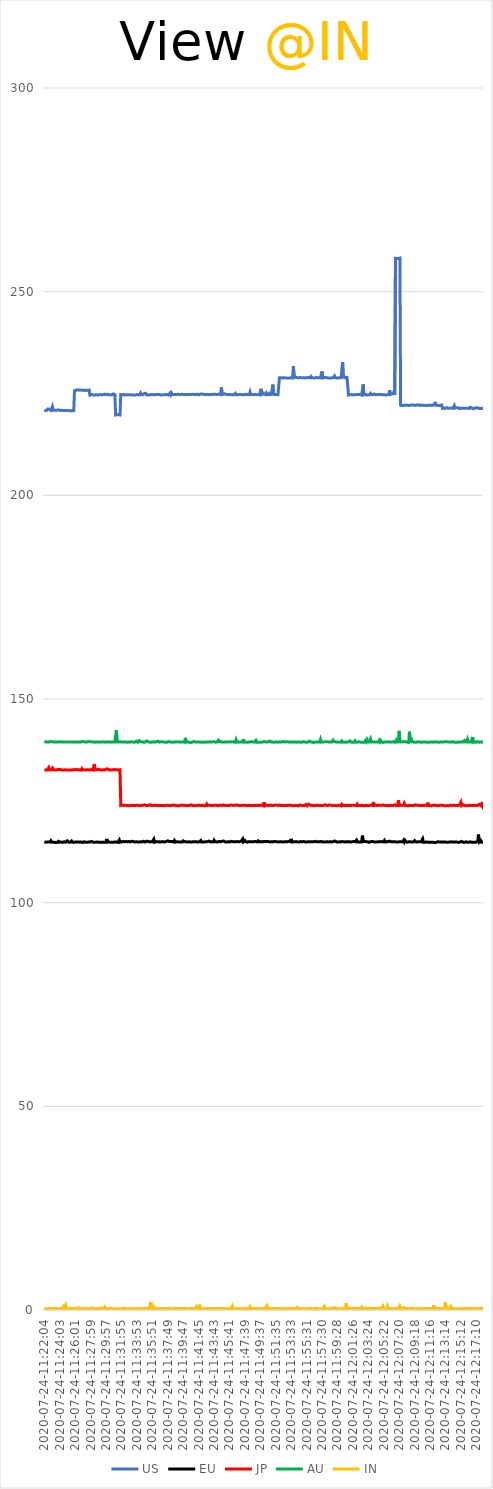
| Category | US | EU | JP | AU | IN |
|---|---|---|---|---|---|
| 2020-07-24-11:22:04 | 220.913 | 114.952 | 132.64 | 139.6 | 0.329 |
| 2020-07-24-11:22:10 | 220.919 | 114.899 | 132.591 | 139.414 | 0.342 |
| 2020-07-24-11:22:16 | 220.847 | 114.837 | 132.584 | 139.466 | 0.325 |
| 2020-07-24-11:22:21 | 220.944 | 114.942 | 132.607 | 139.45 | 0.523 |
| 2020-07-24-11:22:27 | 220.908 | 114.886 | 132.564 | 139.441 | 0.292 |
| 2020-07-24-11:22:33 | 221.206 | 114.859 | 132.6 | 139.367 | 0.326 |
| 2020-07-24-11:22:38 | 220.961 | 114.927 | 133.172 | 139.446 | 0.33 |
| 2020-07-24-11:22:44 | 221.133 | 114.834 | 132.637 | 139.387 | 0.287 |
| 2020-07-24-11:22:49 | 220.93 | 114.868 | 132.773 | 139.54 | 0.345 |
| 2020-07-24-11:22:55 | 220.862 | 115.185 | 132.602 | 139.453 | 0.311 |
| 2020-07-24-11:23:01 | 220.93 | 114.876 | 132.797 | 139.487 | 0.38 |
| 2020-07-24-11:23:06 | 221.796 | 114.824 | 133.045 | 139.453 | 0.331 |
| 2020-07-24-11:23:12 | 220.883 | 114.853 | 132.603 | 139.48 | 0.315 |
| 2020-07-24-11:23:18 | 220.871 | 114.893 | 132.631 | 139.474 | 0.377 |
| 2020-07-24-11:23:23 | 220.881 | 114.811 | 132.611 | 139.424 | 0.389 |
| 2020-07-24-11:23:29 | 221.017 | 114.871 | 132.724 | 139.424 | 0.344 |
| 2020-07-24-11:23:34 | 220.877 | 114.777 | 132.584 | 139.423 | 0.374 |
| 2020-07-24-11:23:40 | 220.997 | 114.881 | 132.594 | 139.419 | 0.363 |
| 2020-07-24-11:23:46 | 220.937 | 114.775 | 132.672 | 139.416 | 0.311 |
| 2020-07-24-11:23:51 | 220.992 | 115.05 | 132.828 | 139.415 | 0.352 |
| 2020-07-24-11:23:57 | 220.928 | 114.827 | 132.726 | 139.496 | 0.313 |
| 2020-07-24-11:24:03 | 220.964 | 114.862 | 132.709 | 139.441 | 0.369 |
| 2020-07-24-11:24:08 | 220.846 | 114.883 | 132.692 | 139.439 | 0.374 |
| 2020-07-24-11:24:14 | 220.808 | 114.864 | 132.578 | 139.391 | 0.303 |
| 2020-07-24-11:24:19 | 220.884 | 114.902 | 132.576 | 139.497 | 0.371 |
| 2020-07-24-11:24:25 | 220.784 | 114.793 | 132.667 | 139.444 | 0.378 |
| 2020-07-24-11:24:31 | 220.826 | 114.891 | 132.562 | 139.415 | 0.858 |
| 2020-07-24-11:24:36 | 220.825 | 114.946 | 132.67 | 139.405 | 0.327 |
| 2020-07-24-11:24:42 | 220.856 | 114.786 | 132.626 | 139.439 | 0.309 |
| 2020-07-24-11:24:48 | 220.884 | 114.836 | 132.647 | 139.421 | 1.147 |
| 2020-07-24-11:24:53 | 220.838 | 114.972 | 132.569 | 139.477 | 0.34 |
| 2020-07-24-11:24:59 | 220.897 | 115.197 | 132.683 | 139.405 | 0.338 |
| 2020-07-24-11:25:04 | 220.836 | 115.03 | 132.574 | 139.429 | 0.334 |
| 2020-07-24-11:25:10 | 220.759 | 114.869 | 132.608 | 139.405 | 0.35 |
| 2020-07-24-11:25:16 | 220.783 | 114.862 | 132.559 | 139.425 | 0.302 |
| 2020-07-24-11:25:21 | 220.828 | 114.834 | 132.646 | 139.453 | 0.391 |
| 2020-07-24-11:25:27 | 220.764 | 114.864 | 132.569 | 139.421 | 0.377 |
| 2020-07-24-11:25:33 | 220.907 | 115.127 | 132.618 | 139.393 | 0.345 |
| 2020-07-24-11:25:38 | 220.799 | 114.861 | 132.607 | 139.454 | 0.37 |
| 2020-07-24-11:25:44 | 220.865 | 114.877 | 132.711 | 139.405 | 0.299 |
| 2020-07-24-11:25:49 | 220.788 | 114.813 | 132.623 | 139.405 | 0.354 |
| 2020-07-24-11:25:55 | 225.671 | 114.894 | 132.633 | 139.54 | 0.45 |
| 2020-07-24-11:26:01 | 225.749 | 114.908 | 132.691 | 139.481 | 0.353 |
| 2020-07-24-11:26:06 | 225.782 | 114.81 | 132.62 | 139.431 | 0.39 |
| 2020-07-24-11:26:12 | 225.771 | 114.895 | 132.662 | 139.432 | 0.387 |
| 2020-07-24-11:26:18 | 225.927 | 114.866 | 132.561 | 139.45 | 0.318 |
| 2020-07-24-11:26:23 | 225.75 | 114.897 | 132.626 | 139.437 | 0.587 |
| 2020-07-24-11:26:29 | 225.818 | 114.86 | 132.694 | 139.499 | 0.336 |
| 2020-07-24-11:26:34 | 225.848 | 114.854 | 132.655 | 139.437 | 0.376 |
| 2020-07-24-11:26:40 | 225.87 | 114.81 | 132.608 | 139.451 | 0.334 |
| 2020-07-24-11:26:46 | 225.871 | 114.915 | 132.546 | 139.432 | 0.292 |
| 2020-07-24-11:26:51 | 225.768 | 114.857 | 132.871 | 139.506 | 0.315 |
| 2020-07-24-11:26:57 | 225.747 | 114.76 | 132.597 | 139.59 | 0.359 |
| 2020-07-24-11:27:03 | 225.859 | 114.923 | 132.592 | 139.412 | 0.365 |
| 2020-07-24-11:27:08 | 225.81 | 114.938 | 132.611 | 139.473 | 0.42 |
| 2020-07-24-11:27:14 | 225.731 | 114.821 | 132.529 | 139.355 | 0.334 |
| 2020-07-24-11:27:19 | 225.773 | 114.843 | 132.571 | 139.447 | 0.36 |
| 2020-07-24-11:27:25 | 225.793 | 114.825 | 132.609 | 139.401 | 0.326 |
| 2020-07-24-11:27:31 | 225.768 | 114.851 | 132.647 | 139.418 | 0.328 |
| 2020-07-24-11:27:36 | 225.814 | 114.885 | 132.62 | 139.417 | 0.392 |
| 2020-07-24-11:27:42 | 225.779 | 114.875 | 132.608 | 139.557 | 0.343 |
| 2020-07-24-11:27:48 | 225.839 | 114.77 | 132.607 | 139.366 | 0.303 |
| 2020-07-24-11:27:53 | 224.618 | 114.869 | 132.574 | 139.496 | 0.335 |
| 2020-07-24-11:27:59 | 224.615 | 114.792 | 132.6 | 139.434 | 0.346 |
| 2020-07-24-11:28:04 | 224.775 | 115.032 | 132.684 | 139.48 | 0.482 |
| 2020-07-24-11:28:10 | 224.878 | 114.884 | 132.647 | 139.506 | 0.492 |
| 2020-07-24-11:28:16 | 224.658 | 114.861 | 132.589 | 139.45 | 0.362 |
| 2020-07-24-11:28:21 | 224.659 | 114.984 | 132.756 | 139.42 | 0.352 |
| 2020-07-24-11:28:27 | 224.617 | 114.818 | 134.012 | 139.428 | 0.314 |
| 2020-07-24-11:28:33 | 224.836 | 114.852 | 132.603 | 139.427 | 0.323 |
| 2020-07-24-11:28:38 | 224.703 | 114.849 | 132.639 | 139.407 | 0.318 |
| 2020-07-24-11:28:44 | 224.753 | 114.886 | 132.623 | 139.494 | 0.307 |
| 2020-07-24-11:28:50 | 224.658 | 114.893 | 132.642 | 139.455 | 0.382 |
| 2020-07-24-11:28:55 | 224.615 | 114.859 | 132.74 | 139.499 | 0.348 |
| 2020-07-24-11:29:01 | 224.637 | 114.843 | 132.618 | 139.457 | 0.412 |
| 2020-07-24-11:29:06 | 224.672 | 114.89 | 132.645 | 139.482 | 0.406 |
| 2020-07-24-11:29:12 | 224.754 | 114.809 | 132.56 | 139.41 | 0.276 |
| 2020-07-24-11:29:18 | 224.624 | 114.789 | 132.601 | 139.423 | 0.342 |
| 2020-07-24-11:29:23 | 224.695 | 114.804 | 132.651 | 139.45 | 0.326 |
| 2020-07-24-11:29:29 | 224.694 | 114.785 | 132.56 | 139.46 | 0.345 |
| 2020-07-24-11:29:35 | 224.688 | 114.805 | 132.584 | 139.486 | 0.317 |
| 2020-07-24-11:29:40 | 224.681 | 114.858 | 132.658 | 139.489 | 0.325 |
| 2020-07-24-11:29:46 | 224.846 | 114.86 | 132.613 | 139.402 | 0.654 |
| 2020-07-24-11:29:51 | 224.737 | 114.804 | 132.641 | 139.439 | 0.324 |
| 2020-07-24-11:29:57 | 224.701 | 114.839 | 132.604 | 139.467 | 0.355 |
| 2020-07-24-11:30:03 | 224.688 | 115.637 | 132.858 | 139.432 | 0.369 |
| 2020-07-24-11:30:08 | 224.825 | 114.923 | 132.937 | 139.459 | 0.384 |
| 2020-07-24-11:30:14 | 224.661 | 114.839 | 132.744 | 139.434 | 0.404 |
| 2020-07-24-11:30:20 | 224.651 | 114.874 | 132.611 | 139.467 | 0.315 |
| 2020-07-24-11:30:25 | 224.674 | 114.814 | 132.602 | 139.442 | 0.327 |
| 2020-07-24-11:30:31 | 224.692 | 114.825 | 132.605 | 139.446 | 0.317 |
| 2020-07-24-11:30:36 | 224.676 | 114.833 | 132.582 | 139.411 | 0.414 |
| 2020-07-24-11:30:42 | 224.654 | 114.821 | 132.578 | 139.412 | 0.344 |
| 2020-07-24-11:30:48 | 224.701 | 114.872 | 132.602 | 139.379 | 0.315 |
| 2020-07-24-11:30:53 | 224.891 | 114.802 | 132.688 | 139.435 | 0.376 |
| 2020-07-24-11:30:59 | 224.686 | 114.794 | 132.687 | 139.498 | 0.313 |
| 2020-07-24-11:31:05 | 224.715 | 114.909 | 132.752 | 139.454 | 0.329 |
| 2020-07-24-11:31:10 | 219.704 | 114.855 | 132.639 | 139.456 | 0.325 |
| 2020-07-24-11:31:16 | 219.683 | 114.889 | 132.636 | 142.39 | 0.436 |
| 2020-07-24-11:31:21 | 219.79 | 114.902 | 132.605 | 139.469 | 0.318 |
| 2020-07-24-11:31:27 | 219.715 | 114.795 | 132.617 | 139.463 | 0.553 |
| 2020-07-24-11:31:33 | 219.81 | 114.836 | 132.596 | 139.435 | 0.339 |
| 2020-07-24-11:31:38 | 219.71 | 115.374 | 132.648 | 139.377 | 0.344 |
| 2020-07-24-11:31:44 | 219.727 | 114.845 | 132.636 | 139.484 | 0.313 |
| 2020-07-24-11:31:50 | 224.736 | 114.926 | 123.873 | 139.382 | 0.351 |
| 2020-07-24-11:31:55 | 224.743 | 114.917 | 123.846 | 139.417 | 0.328 |
| 2020-07-24-11:32:01 | 224.681 | 115.025 | 123.978 | 139.465 | 0.366 |
| 2020-07-24-11:32:06 | 224.673 | 115.03 | 123.887 | 139.48 | 0.373 |
| 2020-07-24-11:32:12 | 224.771 | 114.987 | 123.866 | 139.445 | 0.358 |
| 2020-07-24-11:32:18 | 224.657 | 114.936 | 123.973 | 139.436 | 0.406 |
| 2020-07-24-11:32:23 | 224.621 | 114.925 | 123.91 | 139.485 | 0.339 |
| 2020-07-24-11:32:29 | 224.687 | 115.021 | 123.94 | 139.455 | 0.338 |
| 2020-07-24-11:32:35 | 224.671 | 114.924 | 123.878 | 139.416 | 0.342 |
| 2020-07-24-11:32:40 | 224.748 | 114.94 | 123.85 | 139.386 | 0.326 |
| 2020-07-24-11:32:46 | 224.719 | 114.923 | 123.857 | 139.437 | 0.322 |
| 2020-07-24-11:32:51 | 224.649 | 115.015 | 123.882 | 139.423 | 0.296 |
| 2020-07-24-11:32:57 | 224.67 | 115.031 | 123.793 | 139.398 | 0.349 |
| 2020-07-24-11:33:03 | 224.693 | 114.919 | 123.84 | 139.471 | 0.346 |
| 2020-07-24-11:33:08 | 224.668 | 115 | 123.914 | 139.412 | 0.328 |
| 2020-07-24-11:33:14 | 224.677 | 115.068 | 123.813 | 139.476 | 0.335 |
| 2020-07-24-11:33:19 | 224.648 | 114.99 | 123.851 | 139.413 | 0.351 |
| 2020-07-24-11:33:25 | 224.621 | 115.023 | 123.825 | 139.413 | 0.304 |
| 2020-07-24-11:33:31 | 224.661 | 114.964 | 123.822 | 139.397 | 0.331 |
| 2020-07-24-11:33:36 | 224.655 | 114.882 | 123.856 | 139.408 | 0.374 |
| 2020-07-24-11:33:42 | 224.622 | 114.909 | 123.848 | 139.482 | 0.314 |
| 2020-07-24-11:33:48 | 224.696 | 114.953 | 123.842 | 139.625 | 0.362 |
| 2020-07-24-11:33:53 | 224.727 | 114.931 | 123.928 | 139.499 | 0.42 |
| 2020-07-24-11:33:59 | 224.773 | 114.914 | 123.857 | 139.376 | 0.323 |
| 2020-07-24-11:34:04 | 224.656 | 114.986 | 123.869 | 139.539 | 0.339 |
| 2020-07-24-11:34:10 | 224.748 | 114.88 | 123.878 | 139.779 | 0.355 |
| 2020-07-24-11:34:16 | 224.702 | 114.908 | 123.802 | 139.631 | 0.351 |
| 2020-07-24-11:34:21 | 225.129 | 114.964 | 123.855 | 139.487 | 0.347 |
| 2020-07-24-11:34:27 | 224.814 | 115.108 | 123.919 | 139.462 | 0.435 |
| 2020-07-24-11:34:33 | 224.652 | 114.904 | 123.849 | 139.484 | 0.311 |
| 2020-07-24-11:34:38 | 224.68 | 114.952 | 123.878 | 139.715 | 0.316 |
| 2020-07-24-11:34:44 | 224.698 | 115.058 | 124.071 | 139.406 | 0.304 |
| 2020-07-24-11:34:49 | 225.007 | 114.928 | 124.017 | 139.577 | 0.3 |
| 2020-07-24-11:34:55 | 224.785 | 114.879 | 123.854 | 139.407 | 0.379 |
| 2020-07-24-11:35:01 | 225.054 | 114.974 | 123.867 | 139.494 | 0.547 |
| 2020-07-24-11:35:06 | 224.686 | 115.077 | 123.885 | 139.695 | 0.436 |
| 2020-07-24-11:35:12 | 224.721 | 115.067 | 123.869 | 139.538 | 0.362 |
| 2020-07-24-11:35:17 | 224.606 | 115.056 | 123.934 | 139.553 | 0.359 |
| 2020-07-24-11:35:23 | 224.6 | 114.952 | 123.857 | 139.398 | 0.34 |
| 2020-07-24-11:35:29 | 224.683 | 114.887 | 123.844 | 139.417 | 0.346 |
| 2020-07-24-11:35:34 | 224.648 | 114.936 | 124.065 | 139.396 | 0.338 |
| 2020-07-24-11:35:40 | 224.718 | 114.985 | 123.887 | 139.389 | 1.965 |
| 2020-07-24-11:35:46 | 224.667 | 114.84 | 123.864 | 139.419 | 0.358 |
| 2020-07-24-11:35:51 | 224.769 | 114.948 | 123.915 | 139.446 | 0.379 |
| 2020-07-24-11:35:57 | 224.65 | 114.912 | 123.871 | 139.407 | 0.379 |
| 2020-07-24-11:36:02 | 224.666 | 115.573 | 123.996 | 139.427 | 0.677 |
| 2020-07-24-11:36:08 | 224.749 | 114.838 | 123.906 | 139.419 | 0.332 |
| 2020-07-24-11:36:14 | 224.743 | 114.972 | 124.135 | 139.412 | 0.38 |
| 2020-07-24-11:36:19 | 224.632 | 114.974 | 123.886 | 139.405 | 0.309 |
| 2020-07-24-11:36:25 | 224.745 | 114.963 | 124.003 | 139.543 | 0.367 |
| 2020-07-24-11:36:31 | 224.639 | 114.928 | 123.86 | 139.49 | 0.383 |
| 2020-07-24-11:36:36 | 224.754 | 114.904 | 123.827 | 139.578 | 0.403 |
| 2020-07-24-11:36:42 | 224.666 | 114.95 | 123.829 | 139.41 | 0.363 |
| 2020-07-24-11:36:47 | 224.757 | 114.998 | 123.864 | 139.406 | 0.368 |
| 2020-07-24-11:36:53 | 224.621 | 114.883 | 123.87 | 139.405 | 0.344 |
| 2020-07-24-11:36:59 | 224.636 | 114.905 | 123.862 | 139.515 | 0.389 |
| 2020-07-24-11:37:04 | 224.785 | 114.986 | 123.885 | 139.574 | 0.372 |
| 2020-07-24-11:37:10 | 224.662 | 114.99 | 123.917 | 139.484 | 0.351 |
| 2020-07-24-11:37:16 | 224.618 | 114.943 | 123.846 | 139.466 | 0.349 |
| 2020-07-24-11:37:21 | 224.668 | 114.943 | 123.892 | 139.42 | 0.378 |
| 2020-07-24-11:37:27 | 224.716 | 114.906 | 123.796 | 139.439 | 0.31 |
| 2020-07-24-11:37:32 | 224.746 | 115.005 | 123.98 | 139.406 | 0.331 |
| 2020-07-24-11:37:38 | 224.704 | 115.02 | 123.938 | 139.413 | 0.419 |
| 2020-07-24-11:37:44 | 224.78 | 114.879 | 123.814 | 139.402 | 0.345 |
| 2020-07-24-11:37:49 | 224.665 | 115.175 | 123.845 | 139.45 | 0.344 |
| 2020-07-24-11:37:55 | 224.639 | 114.974 | 123.938 | 139.559 | 0.33 |
| 2020-07-24-11:38:00 | 224.721 | 115.023 | 123.89 | 139.464 | 0.426 |
| 2020-07-24-11:38:06 | 225.075 | 114.961 | 123.907 | 139.442 | 0.357 |
| 2020-07-24-11:38:12 | 224.684 | 115.008 | 123.824 | 139.403 | 0.292 |
| 2020-07-24-11:38:17 | 225.103 | 114.991 | 123.841 | 139.414 | 0.345 |
| 2020-07-24-11:38:23 | 224.779 | 115.028 | 123.886 | 139.561 | 0.334 |
| 2020-07-24-11:38:29 | 224.776 | 115.082 | 123.914 | 139.396 | 0.309 |
| 2020-07-24-11:38:34 | 224.731 | 114.889 | 123.969 | 139.508 | 0.337 |
| 2020-07-24-11:38:40 | 224.8 | 115.226 | 123.898 | 139.44 | 0.356 |
| 2020-07-24-11:38:45 | 224.784 | 114.855 | 123.877 | 139.427 | 0.387 |
| 2020-07-24-11:38:51 | 224.753 | 114.926 | 123.854 | 139.444 | 0.329 |
| 2020-07-24-11:38:57 | 224.747 | 114.933 | 123.827 | 139.405 | 0.322 |
| 2020-07-24-11:39:02 | 224.741 | 115.021 | 123.846 | 139.492 | 0.323 |
| 2020-07-24-11:39:08 | 224.81 | 114.924 | 123.799 | 139.455 | 0.42 |
| 2020-07-24-11:39:14 | 224.781 | 114.948 | 123.803 | 139.442 | 0.33 |
| 2020-07-24-11:39:19 | 224.725 | 114.892 | 123.843 | 139.466 | 0.311 |
| 2020-07-24-11:39:25 | 224.789 | 114.923 | 124.061 | 139.424 | 0.35 |
| 2020-07-24-11:39:30 | 224.785 | 114.928 | 123.924 | 139.471 | 0.33 |
| 2020-07-24-11:39:36 | 224.775 | 114.914 | 123.844 | 139.444 | 0.419 |
| 2020-07-24-11:39:42 | 224.815 | 114.899 | 123.889 | 139.428 | 0.388 |
| 2020-07-24-11:39:47 | 224.692 | 115.17 | 123.827 | 139.468 | 0.378 |
| 2020-07-24-11:39:53 | 224.72 | 114.972 | 123.924 | 139.432 | 0.344 |
| 2020-07-24-11:39:58 | 224.725 | 114.996 | 123.896 | 139.403 | 0.353 |
| 2020-07-24-11:40:04 | 224.734 | 114.96 | 123.85 | 140.462 | 0.37 |
| 2020-07-24-11:40:10 | 224.758 | 114.937 | 123.873 | 139.429 | 0.32 |
| 2020-07-24-11:40:15 | 224.736 | 114.938 | 123.854 | 139.453 | 0.342 |
| 2020-07-24-11:40:21 | 224.847 | 114.901 | 123.825 | 139.429 | 0.325 |
| 2020-07-24-11:40:27 | 224.737 | 114.963 | 123.866 | 139.431 | 0.316 |
| 2020-07-24-11:40:32 | 224.764 | 114.953 | 123.825 | 139.389 | 0.542 |
| 2020-07-24-11:40:38 | 224.741 | 114.929 | 123.847 | 139.432 | 0.324 |
| 2020-07-24-11:40:43 | 224.756 | 114.874 | 123.865 | 139.332 | 0.326 |
| 2020-07-24-11:40:49 | 224.785 | 114.905 | 124.023 | 139.449 | 0.356 |
| 2020-07-24-11:40:55 | 224.749 | 114.909 | 123.876 | 139.365 | 0.349 |
| 2020-07-24-11:41:00 | 224.828 | 115.072 | 123.848 | 139.498 | 0.368 |
| 2020-07-24-11:41:06 | 224.813 | 114.96 | 123.92 | 139.565 | 0.331 |
| 2020-07-24-11:41:12 | 224.724 | 115.111 | 123.873 | 139.417 | 0.367 |
| 2020-07-24-11:41:17 | 224.842 | 114.929 | 123.879 | 139.457 | 0.352 |
| 2020-07-24-11:41:23 | 224.758 | 114.918 | 123.803 | 139.641 | 0.336 |
| 2020-07-24-11:41:28 | 224.723 | 114.935 | 123.937 | 139.424 | 0.742 |
| 2020-07-24-11:41:34 | 224.827 | 114.907 | 123.863 | 139.476 | 0.451 |
| 2020-07-24-11:41:40 | 224.915 | 114.907 | 123.912 | 139.43 | 0.351 |
| 2020-07-24-11:41:45 | 224.674 | 114.896 | 123.939 | 139.419 | 0.386 |
| 2020-07-24-11:41:51 | 224.751 | 114.962 | 123.901 | 139.418 | 1.329 |
| 2020-07-24-11:41:56 | 224.812 | 114.915 | 123.852 | 139.383 | 0.312 |
| 2020-07-24-11:42:02 | 224.754 | 115.247 | 123.924 | 139.408 | 0.31 |
| 2020-07-24-11:42:08 | 224.91 | 114.894 | 123.844 | 139.457 | 0.351 |
| 2020-07-24-11:42:13 | 224.794 | 114.859 | 123.887 | 139.426 | 0.336 |
| 2020-07-24-11:42:19 | 224.802 | 114.892 | 123.899 | 139.401 | 0.285 |
| 2020-07-24-11:42:25 | 224.763 | 114.967 | 123.869 | 139.381 | 0.336 |
| 2020-07-24-11:42:30 | 224.755 | 114.909 | 123.786 | 139.472 | 0.342 |
| 2020-07-24-11:42:36 | 224.718 | 114.904 | 123.879 | 139.439 | 0.338 |
| 2020-07-24-11:42:41 | 224.737 | 114.959 | 123.896 | 139.433 | 0.357 |
| 2020-07-24-11:42:47 | 224.681 | 115 | 124.186 | 139.407 | 0.334 |
| 2020-07-24-11:42:53 | 224.747 | 114.981 | 123.859 | 139.379 | 0.387 |
| 2020-07-24-11:42:58 | 224.814 | 114.96 | 123.869 | 139.429 | 0.325 |
| 2020-07-24-11:43:04 | 224.776 | 115.114 | 123.937 | 139.494 | 0.357 |
| 2020-07-24-11:43:10 | 224.844 | 114.944 | 123.983 | 139.499 | 0.33 |
| 2020-07-24-11:43:15 | 224.778 | 114.917 | 123.902 | 139.435 | 0.36 |
| 2020-07-24-11:43:21 | 224.753 | 115.009 | 123.849 | 139.419 | 0.36 |
| 2020-07-24-11:43:26 | 224.758 | 114.952 | 123.858 | 139.4 | 0.328 |
| 2020-07-24-11:43:32 | 224.751 | 114.999 | 123.844 | 139.508 | 0.321 |
| 2020-07-24-11:43:38 | 224.807 | 114.902 | 123.871 | 139.457 | 0.359 |
| 2020-07-24-11:43:43 | 224.822 | 115.314 | 124.04 | 139.498 | 0.466 |
| 2020-07-24-11:43:49 | 224.837 | 115.033 | 123.933 | 139.402 | 0.343 |
| 2020-07-24-11:43:54 | 224.834 | 114.951 | 123.852 | 139.394 | 0.313 |
| 2020-07-24-11:44:00 | 224.726 | 114.924 | 123.909 | 139.596 | 0.364 |
| 2020-07-24-11:44:06 | 224.866 | 114.992 | 124.082 | 139.461 | 0.37 |
| 2020-07-24-11:44:11 | 224.731 | 114.922 | 123.833 | 139.401 | 0.309 |
| 2020-07-24-11:44:17 | 224.74 | 115.048 | 123.918 | 139.866 | 0.361 |
| 2020-07-24-11:44:23 | 224.868 | 115.013 | 123.884 | 139.509 | 0.379 |
| 2020-07-24-11:44:28 | 224.72 | 114.909 | 123.827 | 139.484 | 0.349 |
| 2020-07-24-11:44:34 | 224.743 | 114.965 | 123.936 | 139.538 | 0.341 |
| 2020-07-24-11:44:39 | 226.491 | 114.918 | 123.864 | 139.446 | 0.306 |
| 2020-07-24-11:44:45 | 224.808 | 115.078 | 123.828 | 139.427 | 0.382 |
| 2020-07-24-11:44:51 | 224.754 | 114.968 | 123.846 | 139.44 | 0.384 |
| 2020-07-24-11:44:56 | 224.824 | 115.136 | 124.004 | 139.447 | 0.318 |
| 2020-07-24-11:45:02 | 224.741 | 114.916 | 123.947 | 139.506 | 0.512 |
| 2020-07-24-11:45:08 | 224.929 | 114.933 | 123.847 | 139.453 | 0.345 |
| 2020-07-24-11:45:13 | 224.76 | 115.027 | 123.988 | 139.504 | 0.424 |
| 2020-07-24-11:45:19 | 224.749 | 114.895 | 123.868 | 139.474 | 0.322 |
| 2020-07-24-11:45:24 | 224.772 | 114.946 | 123.971 | 139.444 | 0.297 |
| 2020-07-24-11:45:30 | 224.757 | 114.971 | 123.829 | 139.435 | 0.29 |
| 2020-07-24-11:45:36 | 224.712 | 114.93 | 123.852 | 139.412 | 0.341 |
| 2020-07-24-11:45:41 | 224.769 | 114.887 | 123.859 | 139.492 | 0.368 |
| 2020-07-24-11:45:47 | 224.724 | 115.127 | 123.841 | 139.672 | 0.379 |
| 2020-07-24-11:45:53 | 224.724 | 115.051 | 123.968 | 139.457 | 0.346 |
| 2020-07-24-11:45:58 | 224.718 | 114.931 | 123.845 | 139.486 | 0.309 |
| 2020-07-24-11:46:04 | 224.688 | 114.985 | 123.881 | 139.52 | 0.98 |
| 2020-07-24-11:46:09 | 224.75 | 115.046 | 123.922 | 139.46 | 0.288 |
| 2020-07-24-11:46:15 | 224.682 | 114.964 | 123.911 | 139.431 | 0.324 |
| 2020-07-24-11:46:21 | 224.724 | 114.96 | 123.856 | 139.419 | 0.343 |
| 2020-07-24-11:46:26 | 225.023 | 114.937 | 123.9 | 139.378 | 0.338 |
| 2020-07-24-11:46:32 | 224.721 | 114.931 | 123.847 | 139.97 | 0.322 |
| 2020-07-24-11:46:37 | 224.748 | 115.006 | 123.993 | 139.456 | 0.36 |
| 2020-07-24-11:46:43 | 224.704 | 114.883 | 123.844 | 139.46 | 0.35 |
| 2020-07-24-11:46:49 | 224.73 | 114.948 | 123.873 | 139.403 | 0.354 |
| 2020-07-24-11:46:54 | 224.782 | 114.904 | 123.882 | 139.452 | 0.356 |
| 2020-07-24-11:47:00 | 224.724 | 114.979 | 123.863 | 139.443 | 0.359 |
| 2020-07-24-11:47:06 | 224.778 | 115.019 | 123.871 | 139.416 | 0.327 |
| 2020-07-24-11:47:11 | 224.69 | 115.099 | 123.862 | 139.481 | 0.331 |
| 2020-07-24-11:47:17 | 224.713 | 114.914 | 123.758 | 139.458 | 0.314 |
| 2020-07-24-11:47:22 | 224.766 | 115.616 | 123.911 | 139.434 | 0.394 |
| 2020-07-24-11:47:28 | 224.689 | 114.906 | 123.843 | 140.121 | 0.331 |
| 2020-07-24-11:47:34 | 224.779 | 114.928 | 123.9 | 139.44 | 0.343 |
| 2020-07-24-11:47:39 | 224.768 | 115.246 | 123.842 | 139.427 | 0.361 |
| 2020-07-24-11:47:45 | 224.687 | 114.993 | 123.86 | 139.451 | 0.486 |
| 2020-07-24-11:47:51 | 224.72 | 114.955 | 123.865 | 139.467 | 0.334 |
| 2020-07-24-11:47:56 | 224.796 | 114.855 | 123.823 | 139.374 | 0.369 |
| 2020-07-24-11:48:02 | 224.758 | 114.967 | 123.842 | 139.42 | 0.363 |
| 2020-07-24-11:48:07 | 224.709 | 114.981 | 123.892 | 139.424 | 0.349 |
| 2020-07-24-11:48:13 | 224.776 | 114.92 | 123.851 | 139.442 | 0.302 |
| 2020-07-24-11:48:19 | 225.342 | 114.928 | 123.86 | 139.434 | 0.738 |
| 2020-07-24-11:48:24 | 224.715 | 114.983 | 123.782 | 139.535 | 0.297 |
| 2020-07-24-11:48:30 | 224.761 | 114.957 | 123.819 | 139.543 | 0.39 |
| 2020-07-24-11:48:35 | 224.775 | 114.922 | 123.945 | 139.428 | 0.309 |
| 2020-07-24-11:48:41 | 224.715 | 114.92 | 123.908 | 139.422 | 0.318 |
| 2020-07-24-11:48:47 | 224.748 | 114.914 | 123.905 | 139.547 | 0.338 |
| 2020-07-24-11:48:52 | 224.793 | 114.998 | 123.82 | 139.415 | 0.337 |
| 2020-07-24-11:48:58 | 224.762 | 114.871 | 123.893 | 139.408 | 0.345 |
| 2020-07-24-11:49:04 | 224.756 | 114.986 | 123.929 | 139.825 | 0.371 |
| 2020-07-24-11:49:09 | 224.712 | 114.949 | 123.829 | 139.363 | 0.306 |
| 2020-07-24-11:49:15 | 224.84 | 114.919 | 123.869 | 139.397 | 0.35 |
| 2020-07-24-11:49:20 | 224.734 | 115.176 | 123.912 | 139.417 | 0.346 |
| 2020-07-24-11:49:26 | 224.763 | 114.943 | 123.828 | 139.329 | 0.318 |
| 2020-07-24-11:49:32 | 224.705 | 114.934 | 123.852 | 139.401 | 0.332 |
| 2020-07-24-11:49:37 | 224.726 | 115.002 | 123.938 | 139.383 | 0.355 |
| 2020-07-24-11:49:43 | 226.164 | 114.995 | 123.787 | 139.395 | 0.35 |
| 2020-07-24-11:49:49 | 224.814 | 114.904 | 123.926 | 139.363 | 0.354 |
| 2020-07-24-11:49:54 | 224.733 | 114.919 | 123.897 | 139.426 | 0.307 |
| 2020-07-24-11:50:00 | 225.072 | 114.942 | 123.869 | 139.4 | 0.333 |
| 2020-07-24-11:50:05 | 224.826 | 115.023 | 124.661 | 139.548 | 0.4 |
| 2020-07-24-11:50:11 | 224.747 | 114.92 | 123.767 | 139.651 | 0.359 |
| 2020-07-24-11:50:17 | 224.737 | 114.988 | 123.815 | 139.461 | 0.322 |
| 2020-07-24-11:50:22 | 225.105 | 114.97 | 123.935 | 139.396 | 0.361 |
| 2020-07-24-11:50:28 | 224.72 | 115.046 | 123.902 | 139.461 | 0.978 |
| 2020-07-24-11:50:33 | 224.915 | 114.928 | 123.895 | 139.379 | 0.379 |
| 2020-07-24-11:50:39 | 224.726 | 114.991 | 123.891 | 139.469 | 0.368 |
| 2020-07-24-11:50:45 | 224.989 | 114.97 | 123.823 | 139.458 | 0.353 |
| 2020-07-24-11:50:50 | 224.728 | 114.908 | 123.819 | 139.682 | 0.346 |
| 2020-07-24-11:50:56 | 224.751 | 114.935 | 123.99 | 139.608 | 0.332 |
| 2020-07-24-11:51:02 | 224.767 | 114.951 | 123.842 | 139.415 | 0.331 |
| 2020-07-24-11:51:07 | 224.691 | 114.959 | 123.846 | 139.547 | 0.339 |
| 2020-07-24-11:51:13 | 227.188 | 114.916 | 123.899 | 139.429 | 0.343 |
| 2020-07-24-11:51:18 | 224.812 | 115.001 | 123.87 | 139.461 | 0.34 |
| 2020-07-24-11:51:24 | 224.802 | 115.021 | 123.823 | 139.375 | 0.35 |
| 2020-07-24-11:51:30 | 224.729 | 114.941 | 123.97 | 139.475 | 0.333 |
| 2020-07-24-11:51:35 | 224.751 | 114.977 | 123.866 | 139.468 | 0.301 |
| 2020-07-24-11:51:41 | 224.728 | 114.996 | 123.944 | 139.425 | 0.366 |
| 2020-07-24-11:51:47 | 224.72 | 114.945 | 123.919 | 139.402 | 0.324 |
| 2020-07-24-11:51:52 | 224.696 | 114.957 | 123.857 | 139.438 | 0.343 |
| 2020-07-24-11:51:58 | 224.777 | 114.909 | 123.816 | 139.429 | 0.349 |
| 2020-07-24-11:52:03 | 228.874 | 114.949 | 123.965 | 139.43 | 0.33 |
| 2020-07-24-11:52:09 | 228.833 | 114.949 | 123.911 | 139.417 | 0.368 |
| 2020-07-24-11:52:15 | 228.862 | 114.915 | 123.841 | 139.393 | 0.332 |
| 2020-07-24-11:52:20 | 228.836 | 114.926 | 123.917 | 139.459 | 0.345 |
| 2020-07-24-11:52:26 | 228.799 | 114.92 | 123.87 | 139.444 | 0.299 |
| 2020-07-24-11:52:32 | 229.003 | 114.905 | 123.847 | 139.546 | 0.305 |
| 2020-07-24-11:52:37 | 228.896 | 114.891 | 123.848 | 139.7 | 0.383 |
| 2020-07-24-11:52:43 | 228.982 | 114.958 | 123.87 | 139.435 | 0.288 |
| 2020-07-24-11:52:48 | 228.825 | 114.982 | 123.849 | 139.445 | 0.298 |
| 2020-07-24-11:52:54 | 228.885 | 114.93 | 123.853 | 139.523 | 0.364 |
| 2020-07-24-11:53:00 | 228.787 | 114.895 | 123.849 | 139.494 | 0.369 |
| 2020-07-24-11:53:05 | 228.827 | 114.978 | 123.861 | 139.506 | 0.364 |
| 2020-07-24-11:53:11 | 228.816 | 115.16 | 123.904 | 139.391 | 0.385 |
| 2020-07-24-11:53:17 | 228.832 | 115.029 | 123.895 | 139.41 | 0.308 |
| 2020-07-24-11:53:22 | 228.811 | 114.991 | 123.917 | 139.498 | 0.391 |
| 2020-07-24-11:53:28 | 228.86 | 114.991 | 123.859 | 139.434 | 0.273 |
| 2020-07-24-11:53:33 | 228.876 | 115.649 | 123.886 | 139.47 | 0.371 |
| 2020-07-24-11:53:39 | 228.84 | 114.905 | 123.788 | 139.417 | 0.364 |
| 2020-07-24-11:53:45 | 228.795 | 114.878 | 123.809 | 139.416 | 0.315 |
| 2020-07-24-11:53:50 | 231.687 | 114.923 | 123.892 | 139.429 | 0.338 |
| 2020-07-24-11:53:56 | 229.216 | 114.891 | 123.828 | 139.429 | 0.377 |
| 2020-07-24-11:54:01 | 229.315 | 114.95 | 123.875 | 139.438 | 0.316 |
| 2020-07-24-11:54:07 | 228.912 | 114.917 | 123.884 | 139.443 | 0.362 |
| 2020-07-24-11:54:13 | 228.896 | 114.935 | 123.892 | 139.399 | 0.322 |
| 2020-07-24-11:54:18 | 228.897 | 114.967 | 123.857 | 139.397 | 0.648 |
| 2020-07-24-11:54:24 | 228.809 | 114.921 | 123.916 | 139.447 | 0.312 |
| 2020-07-24-11:54:30 | 228.842 | 114.953 | 123.769 | 139.453 | 0.396 |
| 2020-07-24-11:54:35 | 228.854 | 114.91 | 123.873 | 139.449 | 0.301 |
| 2020-07-24-11:54:41 | 228.947 | 114.973 | 123.987 | 139.416 | 0.315 |
| 2020-07-24-11:54:46 | 228.818 | 115.007 | 123.878 | 139.381 | 0.394 |
| 2020-07-24-11:54:52 | 228.871 | 114.888 | 123.878 | 139.474 | 0.304 |
| 2020-07-24-11:54:58 | 228.855 | 114.941 | 123.86 | 139.44 | 0.335 |
| 2020-07-24-11:55:03 | 228.888 | 114.991 | 123.87 | 139.506 | 0.344 |
| 2020-07-24-11:55:09 | 228.905 | 115.022 | 123.877 | 139.496 | 0.338 |
| 2020-07-24-11:55:15 | 228.827 | 115.062 | 123.831 | 139.442 | 0.319 |
| 2020-07-24-11:55:20 | 228.866 | 114.917 | 123.807 | 139.43 | 0.324 |
| 2020-07-24-11:55:26 | 228.852 | 114.896 | 124.118 | 139.432 | 0.366 |
| 2020-07-24-11:55:31 | 228.851 | 114.91 | 123.878 | 139.391 | 0.315 |
| 2020-07-24-11:55:37 | 228.858 | 114.905 | 123.785 | 139.373 | 0.303 |
| 2020-07-24-11:55:43 | 228.908 | 114.941 | 123.908 | 139.428 | 0.364 |
| 2020-07-24-11:55:48 | 228.963 | 114.967 | 124.15 | 139.489 | 0.473 |
| 2020-07-24-11:55:54 | 228.871 | 114.929 | 123.979 | 139.654 | 0.381 |
| 2020-07-24-11:56:00 | 228.846 | 114.946 | 123.902 | 139.452 | 0.314 |
| 2020-07-24-11:56:05 | 229.149 | 114.97 | 123.891 | 139.461 | 0.344 |
| 2020-07-24-11:56:11 | 228.9 | 114.931 | 123.89 | 139.382 | 0.365 |
| 2020-07-24-11:56:16 | 228.887 | 114.968 | 123.884 | 139.401 | 0.333 |
| 2020-07-24-11:56:22 | 228.83 | 114.882 | 123.809 | 139.474 | 0.37 |
| 2020-07-24-11:56:28 | 228.855 | 114.952 | 123.824 | 139.381 | 0.324 |
| 2020-07-24-11:56:33 | 228.822 | 114.905 | 123.849 | 139.463 | 0.312 |
| 2020-07-24-11:56:39 | 228.86 | 115.054 | 123.897 | 139.408 | 0.439 |
| 2020-07-24-11:56:45 | 228.924 | 115 | 123.893 | 139.417 | 0.291 |
| 2020-07-24-11:56:50 | 228.759 | 114.952 | 123.862 | 139.426 | 0.381 |
| 2020-07-24-11:56:56 | 228.871 | 114.944 | 123.907 | 139.472 | 0.357 |
| 2020-07-24-11:57:01 | 228.958 | 114.933 | 123.897 | 139.477 | 0.312 |
| 2020-07-24-11:57:07 | 228.88 | 114.894 | 123.848 | 139.476 | 0.308 |
| 2020-07-24-11:57:13 | 228.873 | 114.931 | 123.826 | 139.418 | 0.336 |
| 2020-07-24-11:57:18 | 228.892 | 114.884 | 123.858 | 140.044 | 0.302 |
| 2020-07-24-11:57:24 | 228.917 | 115.038 | 123.85 | 139.417 | 0.331 |
| 2020-07-24-11:57:30 | 230.437 | 114.975 | 123.816 | 139.409 | 0.32 |
| 2020-07-24-11:57:35 | 228.817 | 114.897 | 123.818 | 139.442 | 0.312 |
| 2020-07-24-11:57:41 | 228.906 | 114.95 | 123.861 | 139.436 | 0.361 |
| 2020-07-24-11:57:46 | 228.939 | 114.929 | 123.87 | 139.48 | 0.88 |
| 2020-07-24-11:57:52 | 228.801 | 114.949 | 124.035 | 139.354 | 0.394 |
| 2020-07-24-11:57:58 | 228.931 | 114.902 | 123.933 | 139.472 | 0.482 |
| 2020-07-24-11:58:03 | 228.912 | 114.921 | 123.879 | 139.494 | 0.332 |
| 2020-07-24-11:58:09 | 228.847 | 114.959 | 123.904 | 139.517 | 0.385 |
| 2020-07-24-11:58:15 | 228.782 | 115.037 | 123.846 | 139.476 | 0.325 |
| 2020-07-24-11:58:20 | 228.779 | 114.893 | 123.792 | 139.447 | 0.486 |
| 2020-07-24-11:58:26 | 228.824 | 114.889 | 124.022 | 139.482 | 0.314 |
| 2020-07-24-11:58:31 | 228.789 | 114.966 | 123.902 | 139.424 | 0.389 |
| 2020-07-24-11:58:37 | 228.912 | 114.902 | 123.899 | 139.413 | 0.338 |
| 2020-07-24-11:58:43 | 228.839 | 114.913 | 123.911 | 139.427 | 0.313 |
| 2020-07-24-11:58:48 | 228.886 | 114.92 | 123.857 | 139.366 | 0.501 |
| 2020-07-24-11:58:54 | 228.841 | 114.942 | 123.848 | 139.892 | 0.315 |
| 2020-07-24-11:59:00 | 228.863 | 115.051 | 123.854 | 139.566 | 0.32 |
| 2020-07-24-11:59:05 | 229.327 | 115.147 | 123.817 | 139.584 | 0.347 |
| 2020-07-24-11:59:11 | 228.89 | 114.922 | 123.862 | 139.51 | 0.557 |
| 2020-07-24-11:59:16 | 228.832 | 114.997 | 123.859 | 139.59 | 0.318 |
| 2020-07-24-11:59:22 | 228.813 | 115.019 | 123.811 | 139.416 | 0.299 |
| 2020-07-24-11:59:28 | 228.8 | 114.863 | 123.882 | 139.41 | 0.353 |
| 2020-07-24-11:59:33 | 228.825 | 114.89 | 123.848 | 139.409 | 0.333 |
| 2020-07-24-11:59:39 | 228.854 | 114.93 | 123.803 | 139.384 | 0.345 |
| 2020-07-24-11:59:45 | 228.852 | 114.95 | 123.95 | 139.437 | 0.297 |
| 2020-07-24-11:59:50 | 228.863 | 114.91 | 123.821 | 139.323 | 0.306 |
| 2020-07-24-11:59:56 | 228.854 | 114.953 | 123.777 | 139.405 | 0.396 |
| 2020-07-24-12:00:01 | 228.966 | 115.022 | 124.152 | 139.658 | 0.538 |
| 2020-07-24-12:00:07 | 232.723 | 114.886 | 123.917 | 139.407 | 0.349 |
| 2020-07-24-12:00:13 | 228.76 | 114.953 | 123.854 | 139.448 | 0.35 |
| 2020-07-24-12:00:18 | 229.214 | 114.966 | 123.792 | 139.434 | 0.41 |
| 2020-07-24-12:00:24 | 229.036 | 114.902 | 123.85 | 139.463 | 0.329 |
| 2020-07-24-12:00:30 | 228.85 | 114.901 | 123.961 | 139.393 | 0.33 |
| 2020-07-24-12:00:35 | 228.818 | 114.963 | 123.866 | 139.446 | 1.616 |
| 2020-07-24-12:00:41 | 228.933 | 115.053 | 123.883 | 139.429 | 0.371 |
| 2020-07-24-12:00:46 | 228.866 | 114.92 | 123.836 | 139.389 | 0.328 |
| 2020-07-24-12:00:52 | 224.618 | 114.973 | 123.924 | 139.436 | 0.356 |
| 2020-07-24-12:00:58 | 224.724 | 114.975 | 123.894 | 139.489 | 0.323 |
| 2020-07-24-12:01:03 | 224.705 | 114.932 | 123.891 | 139.722 | 0.371 |
| 2020-07-24-12:01:09 | 224.72 | 114.871 | 123.841 | 139.68 | 0.382 |
| 2020-07-24-12:01:15 | 224.738 | 114.911 | 123.936 | 139.386 | 0.451 |
| 2020-07-24-12:01:20 | 224.662 | 114.932 | 123.892 | 139.445 | 0.32 |
| 2020-07-24-12:01:26 | 224.69 | 114.908 | 123.884 | 139.363 | 0.327 |
| 2020-07-24-12:01:31 | 224.602 | 115.026 | 123.9 | 139.452 | 0.406 |
| 2020-07-24-12:01:37 | 224.664 | 114.899 | 123.958 | 139.454 | 0.424 |
| 2020-07-24-12:01:43 | 224.761 | 114.981 | 123.874 | 139.714 | 0.428 |
| 2020-07-24-12:01:48 | 224.69 | 114.933 | 123.83 | 139.368 | 0.312 |
| 2020-07-24-12:01:54 | 224.725 | 115.37 | 123.83 | 139.455 | 0.316 |
| 2020-07-24-12:01:59 | 224.78 | 114.905 | 124.162 | 139.403 | 0.409 |
| 2020-07-24-12:02:05 | 224.658 | 115.001 | 123.854 | 139.491 | 0.299 |
| 2020-07-24-12:02:11 | 224.748 | 114.926 | 123.834 | 139.53 | 0.334 |
| 2020-07-24-12:02:16 | 224.668 | 114.978 | 123.87 | 139.47 | 0.304 |
| 2020-07-24-12:02:22 | 224.739 | 114.908 | 123.873 | 139.4 | 0.345 |
| 2020-07-24-12:02:28 | 224.603 | 114.876 | 123.883 | 139.492 | 0.342 |
| 2020-07-24-12:02:33 | 224.6 | 114.917 | 123.805 | 139.399 | 0.721 |
| 2020-07-24-12:02:39 | 224.798 | 116.456 | 123.859 | 139.539 | 0.359 |
| 2020-07-24-12:02:44 | 227.227 | 115.003 | 123.998 | 139.372 | 0.408 |
| 2020-07-24-12:02:50 | 224.699 | 114.908 | 123.784 | 139.366 | 0.289 |
| 2020-07-24-12:02:56 | 224.686 | 115.018 | 123.827 | 139.415 | 0.305 |
| 2020-07-24-12:03:01 | 224.768 | 115.021 | 123.874 | 139.727 | 0.494 |
| 2020-07-24-12:03:07 | 224.751 | 114.981 | 123.887 | 139.478 | 0.365 |
| 2020-07-24-12:03:13 | 224.629 | 114.906 | 123.838 | 139.963 | 0.37 |
| 2020-07-24-12:03:18 | 224.598 | 114.968 | 123.914 | 139.452 | 0.313 |
| 2020-07-24-12:03:24 | 224.702 | 114.957 | 123.804 | 139.413 | 0.35 |
| 2020-07-24-12:03:29 | 224.735 | 114.815 | 123.824 | 139.426 | 0.365 |
| 2020-07-24-12:03:35 | 224.681 | 114.896 | 123.886 | 139.409 | 0.445 |
| 2020-07-24-12:03:41 | 224.998 | 114.955 | 123.987 | 140.202 | 0.315 |
| 2020-07-24-12:03:46 | 224.733 | 115.09 | 123.974 | 139.451 | 0.34 |
| 2020-07-24-12:03:52 | 224.719 | 115.033 | 123.778 | 139.478 | 0.359 |
| 2020-07-24-12:03:57 | 224.72 | 115.106 | 123.857 | 139.496 | 0.34 |
| 2020-07-24-12:04:03 | 224.721 | 114.941 | 124.695 | 139.414 | 0.422 |
| 2020-07-24-12:04:09 | 224.899 | 114.895 | 123.865 | 139.435 | 0.386 |
| 2020-07-24-12:04:14 | 224.733 | 114.914 | 123.846 | 139.428 | 0.358 |
| 2020-07-24-12:04:20 | 224.671 | 114.88 | 123.911 | 139.457 | 0.407 |
| 2020-07-24-12:04:26 | 224.622 | 114.901 | 123.844 | 139.335 | 0.301 |
| 2020-07-24-12:04:31 | 224.757 | 114.905 | 123.86 | 139.431 | 0.425 |
| 2020-07-24-12:04:37 | 224.74 | 114.946 | 123.955 | 139.452 | 0.346 |
| 2020-07-24-12:04:42 | 224.786 | 114.961 | 123.95 | 139.443 | 0.374 |
| 2020-07-24-12:04:48 | 224.812 | 114.929 | 123.842 | 139.82 | 0.337 |
| 2020-07-24-12:04:54 | 224.748 | 114.932 | 123.867 | 139.468 | 0.334 |
| 2020-07-24-12:04:59 | 224.767 | 114.988 | 123.854 | 139.768 | 0.298 |
| 2020-07-24-12:05:05 | 224.764 | 114.965 | 123.894 | 139.448 | 0.389 |
| 2020-07-24-12:05:11 | 224.66 | 114.979 | 123.829 | 139.409 | 0.359 |
| 2020-07-24-12:05:16 | 224.7 | 114.955 | 123.99 | 139.329 | 0.931 |
| 2020-07-24-12:05:22 | 224.735 | 114.912 | 123.893 | 139.413 | 0.376 |
| 2020-07-24-12:05:27 | 224.715 | 115.255 | 123.838 | 139.396 | 0.294 |
| 2020-07-24-12:05:33 | 224.608 | 114.919 | 123.894 | 139.404 | 0.323 |
| 2020-07-24-12:05:39 | 224.641 | 114.97 | 123.898 | 139.497 | 0.314 |
| 2020-07-24-12:05:44 | 224.736 | 114.931 | 123.915 | 139.366 | 0.316 |
| 2020-07-24-12:05:50 | 224.684 | 114.985 | 123.793 | 139.424 | 0.907 |
| 2020-07-24-12:05:55 | 224.704 | 115.005 | 123.863 | 139.391 | 0.335 |
| 2020-07-24-12:06:01 | 224.765 | 115.209 | 123.876 | 139.48 | 0.356 |
| 2020-07-24-12:06:07 | 225.815 | 115.099 | 124.024 | 139.445 | 0.368 |
| 2020-07-24-12:06:12 | 224.772 | 114.921 | 123.868 | 139.433 | 0.355 |
| 2020-07-24-12:06:18 | 224.737 | 114.944 | 123.934 | 139.428 | 0.348 |
| 2020-07-24-12:06:24 | 224.883 | 114.984 | 123.901 | 139.458 | 0.314 |
| 2020-07-24-12:06:29 | 224.694 | 114.931 | 123.895 | 139.445 | 0.32 |
| 2020-07-24-12:06:35 | 225.012 | 114.939 | 123.815 | 139.496 | 0.343 |
| 2020-07-24-12:06:40 | 225.496 | 114.94 | 123.878 | 139.45 | 0.354 |
| 2020-07-24-12:06:46 | 224.704 | 114.989 | 124.039 | 139.388 | 0.345 |
| 2020-07-24-12:06:52 | 258.18 | 114.944 | 123.918 | 139.434 | 0.325 |
| 2020-07-24-12:06:57 | 258.157 | 114.922 | 123.804 | 139.91 | 0.498 |
| 2020-07-24-12:07:03 | 258.134 | 114.873 | 123.893 | 139.453 | 0.379 |
| 2020-07-24-12:07:09 | 258.183 | 115.044 | 123.901 | 139.462 | 0.374 |
| 2020-07-24-12:07:14 | 258.149 | 114.908 | 125.129 | 139.488 | 0.612 |
| 2020-07-24-12:07:20 | 258.106 | 115.03 | 123.875 | 142.183 | 0.311 |
| 2020-07-24-12:07:26 | 258.243 | 114.964 | 123.909 | 139.497 | 0.836 |
| 2020-07-24-12:07:31 | 222.108 | 114.96 | 123.888 | 139.426 | 0.374 |
| 2020-07-24-12:07:37 | 222.127 | 114.973 | 123.884 | 139.452 | 0.364 |
| 2020-07-24-12:07:43 | 222.016 | 114.932 | 123.89 | 139.45 | 0.328 |
| 2020-07-24-12:07:48 | 222.114 | 114.975 | 123.856 | 139.506 | 0.339 |
| 2020-07-24-12:07:54 | 222.107 | 115.288 | 123.932 | 139.515 | 0.57 |
| 2020-07-24-12:07:59 | 222.342 | 114.887 | 124.361 | 139.492 | 0.326 |
| 2020-07-24-12:08:05 | 222.129 | 115.265 | 123.86 | 139.491 | 0.316 |
| 2020-07-24-12:08:11 | 222.134 | 114.988 | 123.94 | 139.479 | 0.39 |
| 2020-07-24-12:08:16 | 222.123 | 114.903 | 123.829 | 139.434 | 0.372 |
| 2020-07-24-12:08:22 | 222.136 | 114.836 | 123.833 | 139.413 | 0.307 |
| 2020-07-24-12:08:27 | 222.094 | 114.98 | 123.808 | 139.463 | 0.336 |
| 2020-07-24-12:08:33 | 222.124 | 114.926 | 123.83 | 139.353 | 0.41 |
| 2020-07-24-12:08:39 | 222.067 | 114.876 | 123.883 | 141.976 | 0.299 |
| 2020-07-24-12:08:44 | 222.202 | 114.955 | 123.824 | 139.441 | 0.343 |
| 2020-07-24-12:08:50 | 222.175 | 114.908 | 123.836 | 140.47 | 0.369 |
| 2020-07-24-12:08:56 | 222.155 | 114.896 | 123.966 | 139.513 | 0.365 |
| 2020-07-24-12:09:01 | 222.201 | 114.877 | 123.871 | 139.487 | 0.388 |
| 2020-07-24-12:09:07 | 222.194 | 114.893 | 123.949 | 139.459 | 0.319 |
| 2020-07-24-12:09:12 | 222.127 | 115.12 | 123.823 | 139.392 | 0.322 |
| 2020-07-24-12:09:18 | 222.06 | 115.221 | 123.915 | 139.423 | 0.362 |
| 2020-07-24-12:09:24 | 222.12 | 114.966 | 124.001 | 139.468 | 0.332 |
| 2020-07-24-12:09:29 | 222.129 | 114.965 | 123.833 | 139.376 | 0.308 |
| 2020-07-24-12:09:35 | 222.172 | 114.901 | 123.903 | 139.44 | 0.302 |
| 2020-07-24-12:09:40 | 222.388 | 114.967 | 123.911 | 139.502 | 0.363 |
| 2020-07-24-12:09:46 | 222.229 | 114.96 | 123.915 | 139.371 | 0.356 |
| 2020-07-24-12:09:52 | 222.463 | 114.921 | 123.887 | 139.428 | 0.42 |
| 2020-07-24-12:09:57 | 222.081 | 114.931 | 123.835 | 139.428 | 0.335 |
| 2020-07-24-12:10:03 | 222.171 | 114.978 | 123.908 | 139.464 | 0.351 |
| 2020-07-24-12:10:09 | 222.157 | 114.951 | 123.865 | 139.426 | 0.326 |
| 2020-07-24-12:10:14 | 222.17 | 114.863 | 123.866 | 139.372 | 0.355 |
| 2020-07-24-12:10:20 | 222.102 | 115.654 | 123.838 | 139.443 | 0.348 |
| 2020-07-24-12:10:25 | 222.171 | 114.836 | 123.863 | 139.473 | 0.296 |
| 2020-07-24-12:10:31 | 222.119 | 114.821 | 123.833 | 139.424 | 0.342 |
| 2020-07-24-12:10:37 | 222.095 | 114.808 | 123.922 | 139.427 | 0.399 |
| 2020-07-24-12:10:42 | 222.069 | 114.803 | 123.958 | 139.418 | 0.376 |
| 2020-07-24-12:10:48 | 222.199 | 114.885 | 123.828 | 139.426 | 0.319 |
| 2020-07-24-12:10:53 | 222.055 | 114.946 | 123.878 | 139.457 | 0.343 |
| 2020-07-24-12:10:59 | 222.156 | 114.853 | 124.561 | 139.365 | 0.3 |
| 2020-07-24-12:11:05 | 222.109 | 114.922 | 123.897 | 139.424 | 0.353 |
| 2020-07-24-12:11:10 | 222.166 | 114.798 | 123.836 | 139.404 | 0.397 |
| 2020-07-24-12:11:16 | 222.16 | 114.871 | 123.809 | 139.441 | 0.348 |
| 2020-07-24-12:11:22 | 222.103 | 114.85 | 123.865 | 139.438 | 0.354 |
| 2020-07-24-12:11:27 | 222.044 | 114.84 | 123.805 | 139.41 | 0.314 |
| 2020-07-24-12:11:33 | 222.096 | 114.811 | 123.871 | 139.407 | 0.329 |
| 2020-07-24-12:11:38 | 222.151 | 114.849 | 123.892 | 139.484 | 0.291 |
| 2020-07-24-12:11:44 | 222.126 | 114.808 | 123.906 | 139.437 | 1.156 |
| 2020-07-24-12:11:50 | 222.179 | 114.964 | 123.955 | 139.408 | 0.341 |
| 2020-07-24-12:11:55 | 222.917 | 114.745 | 123.875 | 139.428 | 0.399 |
| 2020-07-24-12:12:01 | 222.148 | 114.928 | 123.873 | 139.514 | 0.373 |
| 2020-07-24-12:12:07 | 222.076 | 114.849 | 123.935 | 139.432 | 0.336 |
| 2020-07-24-12:12:12 | 222.11 | 115.045 | 123.879 | 139.438 | 0.444 |
| 2020-07-24-12:12:18 | 222.158 | 114.965 | 123.844 | 139.419 | 0.363 |
| 2020-07-24-12:12:23 | 222.046 | 114.841 | 123.82 | 139.452 | 0.397 |
| 2020-07-24-12:12:29 | 222.024 | 114.869 | 123.907 | 139.394 | 0.293 |
| 2020-07-24-12:12:35 | 222.111 | 114.883 | 123.946 | 139.444 | 0.37 |
| 2020-07-24-12:12:40 | 222.133 | 114.869 | 123.915 | 139.466 | 0.368 |
| 2020-07-24-12:12:46 | 222.171 | 115.005 | 123.923 | 139.402 | 0.368 |
| 2020-07-24-12:12:51 | 221.329 | 114.914 | 123.85 | 139.416 | 0.343 |
| 2020-07-24-12:12:57 | 221.347 | 114.884 | 123.869 | 139.436 | 0.318 |
| 2020-07-24-12:13:03 | 221.393 | 114.861 | 123.802 | 139.481 | 0.353 |
| 2020-07-24-12:13:08 | 221.37 | 114.879 | 123.809 | 139.431 | 0.336 |
| 2020-07-24-12:13:14 | 221.347 | 114.882 | 123.932 | 139.53 | 1.888 |
| 2020-07-24-12:13:20 | 221.352 | 114.798 | 123.813 | 139.366 | 0.412 |
| 2020-07-24-12:13:25 | 221.524 | 114.821 | 123.829 | 139.519 | 0.324 |
| 2020-07-24-12:13:31 | 221.416 | 114.863 | 123.839 | 139.461 | 0.404 |
| 2020-07-24-12:13:36 | 221.362 | 114.847 | 123.827 | 139.449 | 0.367 |
| 2020-07-24-12:13:42 | 221.423 | 114.829 | 123.783 | 139.426 | 0.298 |
| 2020-07-24-12:13:48 | 221.421 | 114.89 | 123.882 | 139.425 | 0.3 |
| 2020-07-24-12:13:53 | 221.327 | 114.862 | 123.928 | 139.409 | 0.838 |
| 2020-07-24-12:13:59 | 221.404 | 114.937 | 123.852 | 139.404 | 0.315 |
| 2020-07-24-12:14:04 | 221.307 | 114.744 | 123.844 | 139.528 | 0.339 |
| 2020-07-24-12:14:10 | 221.376 | 114.884 | 123.871 | 139.54 | 0.396 |
| 2020-07-24-12:14:16 | 221.455 | 114.937 | 123.946 | 139.414 | 0.34 |
| 2020-07-24-12:14:21 | 222.041 | 114.875 | 123.891 | 139.389 | 0.318 |
| 2020-07-24-12:14:27 | 221.406 | 114.858 | 123.859 | 139.399 | 0.379 |
| 2020-07-24-12:14:33 | 221.452 | 114.917 | 123.966 | 139.378 | 0.305 |
| 2020-07-24-12:14:38 | 221.51 | 114.866 | 123.843 | 139.412 | 0.397 |
| 2020-07-24-12:14:44 | 221.428 | 114.85 | 123.887 | 139.361 | 0.34 |
| 2020-07-24-12:14:49 | 221.49 | 114.842 | 123.866 | 139.559 | 0.332 |
| 2020-07-24-12:14:55 | 221.445 | 114.855 | 123.857 | 139.424 | 0.341 |
| 2020-07-24-12:15:01 | 221.295 | 114.842 | 123.953 | 139.425 | 0.502 |
| 2020-07-24-12:15:06 | 221.531 | 114.871 | 123.918 | 139.452 | 0.296 |
| 2020-07-24-12:15:12 | 221.387 | 114.857 | 124.683 | 139.464 | 0.372 |
| 2020-07-24-12:15:17 | 221.495 | 115.049 | 123.81 | 139.461 | 0.323 |
| 2020-07-24-12:15:23 | 221.352 | 115.037 | 123.874 | 139.36 | 0.302 |
| 2020-07-24-12:15:29 | 221.339 | 114.838 | 124.045 | 139.462 | 0.291 |
| 2020-07-24-12:15:34 | 221.369 | 114.877 | 123.877 | 139.415 | 0.341 |
| 2020-07-24-12:15:40 | 221.375 | 114.804 | 123.88 | 139.794 | 0.341 |
| 2020-07-24-12:15:46 | 221.376 | 114.879 | 123.852 | 139.447 | 0.381 |
| 2020-07-24-12:15:51 | 221.388 | 114.936 | 123.8 | 139.485 | 0.401 |
| 2020-07-24-12:15:57 | 221.406 | 114.856 | 123.814 | 139.474 | 0.333 |
| 2020-07-24-12:16:02 | 221.348 | 114.823 | 123.814 | 140.064 | 0.306 |
| 2020-07-24-12:16:08 | 221.402 | 114.86 | 123.994 | 139.436 | 0.358 |
| 2020-07-24-12:16:14 | 221.395 | 114.852 | 123.921 | 139.405 | 0.348 |
| 2020-07-24-12:16:19 | 221.334 | 114.818 | 123.775 | 139.429 | 0.321 |
| 2020-07-24-12:16:25 | 221.615 | 114.934 | 123.829 | 139.37 | 0.329 |
| 2020-07-24-12:16:30 | 221.407 | 114.977 | 123.785 | 139.443 | 0.324 |
| 2020-07-24-12:16:36 | 221.456 | 114.807 | 123.869 | 139.396 | 0.364 |
| 2020-07-24-12:16:42 | 221.473 | 114.922 | 123.809 | 140.648 | 0.325 |
| 2020-07-24-12:16:47 | 221.257 | 114.835 | 123.857 | 139.378 | 0.318 |
| 2020-07-24-12:16:53 | 221.381 | 114.857 | 123.85 | 139.368 | 0.364 |
| 2020-07-24-12:16:59 | 221.373 | 114.801 | 123.93 | 139.422 | 0.358 |
| 2020-07-24-12:17:04 | 221.345 | 114.893 | 123.847 | 139.433 | 0.377 |
| 2020-07-24-12:17:10 | 221.511 | 114.863 | 123.827 | 139.396 | 0.39 |
| 2020-07-24-12:17:15 | 221.339 | 115.014 | 123.819 | 139.485 | 0.365 |
| 2020-07-24-12:17:21 | 221.44 | 115.131 | 123.91 | 139.564 | 0.331 |
| 2020-07-24-12:17:27 | 221.41 | 116.709 | 123.879 | 139.407 | 0.342 |
| 2020-07-24-12:17:32 | 221.351 | 114.901 | 124.138 | 139.376 | 0.303 |
| 2020-07-24-12:17:38 | 221.389 | 114.932 | 123.997 | 139.456 | 0.356 |
| 2020-07-24-12:17:43 | 221.297 | 115.24 | 123.852 | 139.46 | 0.413 |
| 2020-07-24-12:17:49 | 221.405 | 114.858 | 124.166 | 139.364 | 0.337 |
| 2020-07-24-12:17:55 | 221.338 | 114.907 | 123.812 | 139.401 | 0.339 |
| 2020-07-24-12:18:00 | 221.361 | 114.853 | 124.637 | 139.424 | 0.431 |
| 2020-07-24-12:18:06 | 221.438 | 114.842 | 123.859 | 139.495 | 0.343 |